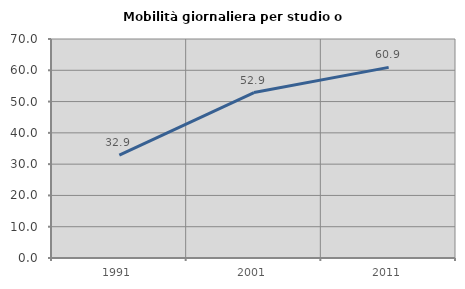
| Category | Mobilità giornaliera per studio o lavoro |
|---|---|
| 1991.0 | 32.886 |
| 2001.0 | 52.893 |
| 2011.0 | 60.938 |